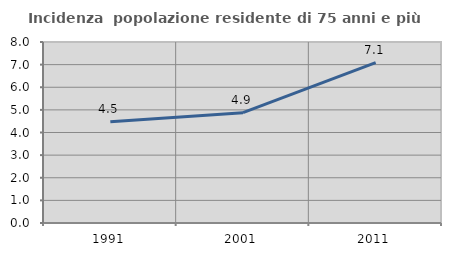
| Category | Incidenza  popolazione residente di 75 anni e più |
|---|---|
| 1991.0 | 4.475 |
| 2001.0 | 4.877 |
| 2011.0 | 7.087 |